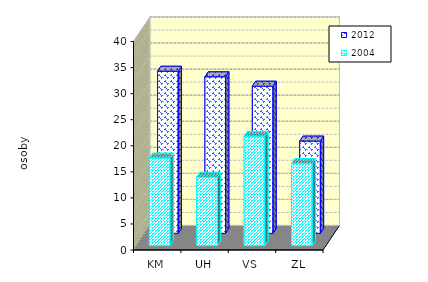
| Category | 2012 | 2004 |
|---|---|---|
| KM | 31.109 | 16.788 |
| UH | 30.037 | 13.118 |
| VS | 28.238 | 20.961 |
| ZL | 17.705 | 15.733 |